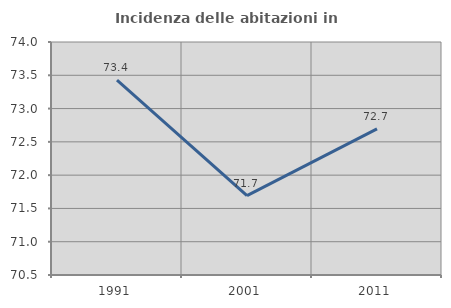
| Category | Incidenza delle abitazioni in proprietà  |
|---|---|
| 1991.0 | 73.426 |
| 2001.0 | 71.691 |
| 2011.0 | 72.696 |